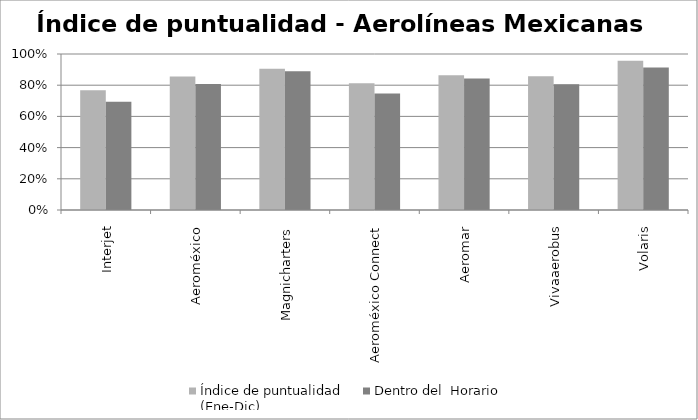
| Category | Índice de puntualidad
(Ene-Dic) | Dentro del  Horario |
|---|---|---|
| Interjet | 0.768 | 0.693 |
| Aeroméxico | 0.856 | 0.808 |
| Magnicharters | 0.905 | 0.889 |
| Aeroméxico Connect | 0.813 | 0.747 |
| Aeromar | 0.864 | 0.844 |
| Vivaaerobus | 0.858 | 0.806 |
| Volaris | 0.957 | 0.913 |